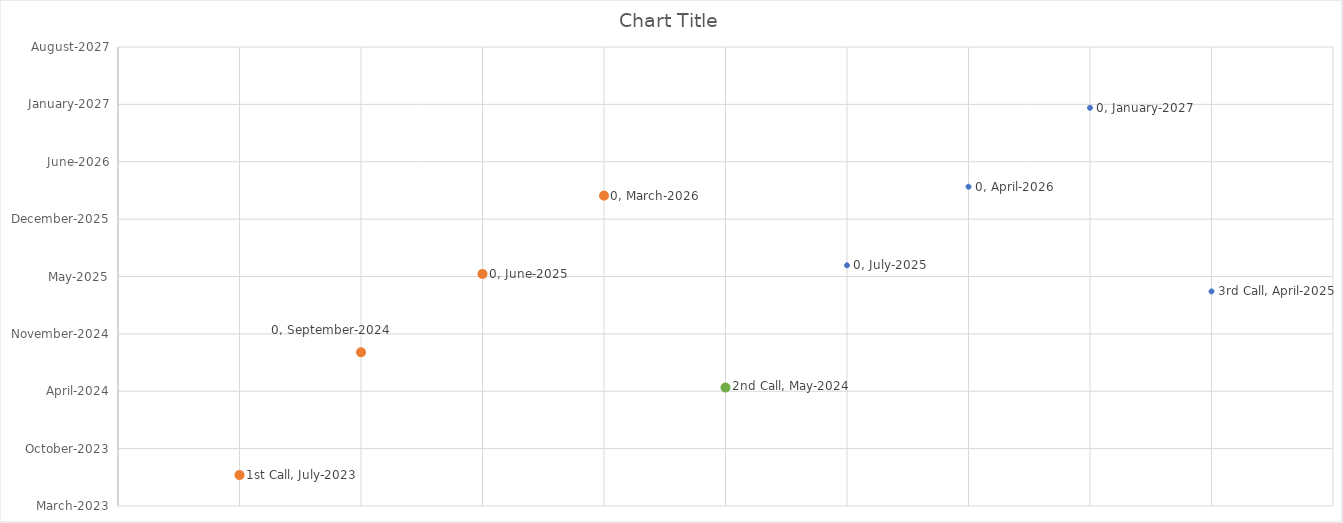
| Category | Series 0 |
|---|---|
| 0 | 2023-07-01 |
| 1 | 2024-09-01 |
| 2 | 2025-06-01 |
| 3 | 2026-03-01 |
| 4 | 2024-05-01 |
| 5 | 2025-07-01 |
| 6 | 2026-04-01 |
| 7 | 2027-01-01 |
| 8 | 2025-04-01 |
| 9 | 2026-06-01 |
| 10 | 2027-03-01 |
| 11 | 2027-12-01 |